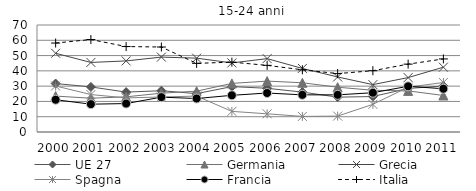
| Category | UE 27 | Germania | Grecia | Spagna | Francia | Italia |
|---|---|---|---|---|---|---|
| 2000 | 31.7 | 23.5 | 51.5 | 30.1 | 21.1 | 58.2 |
| 2001 | 29.5 | 22.1 | 45.5 | 24.5 | 18.2 | 60.5 |
| 2002 | 26.1 | 23 | 46.5 | 22.3 | 18.6 | 55.9 |
| 2003 | 27 | 25.4 | 49 | 22.9 | 22.8 | 55.6 |
| 2004 | 25.1 | 26.7 | 48.3 | 23.5 | 21.9 | 44.9 |
| 2005 | 29.7 | 31.8 | 45.2 | 13.5 | 24 | 45.7 |
| 2006 | 28.6 | 33.3 | 48 | 11.9 | 25.5 | 43.6 |
| 2007 | 26.1 | 32.2 | 41.6 | 10.2 | 24.3 | 40.7 |
| 2008 | 22.8 | 29.3 | 36 | 10.4 | 24.3 | 38.2 |
| 2009 | 23.2 | 27.3 | 31 | 18.1 | 25.7 | 40.1 |
| 2010 | 28.5 | 26.9 | 35.6 | 29.3 | 29.9 | 44.4 |
| 2011 | 30.1 | 23.9 | 42.4 | 32.4 | 28.3 | 47.8 |